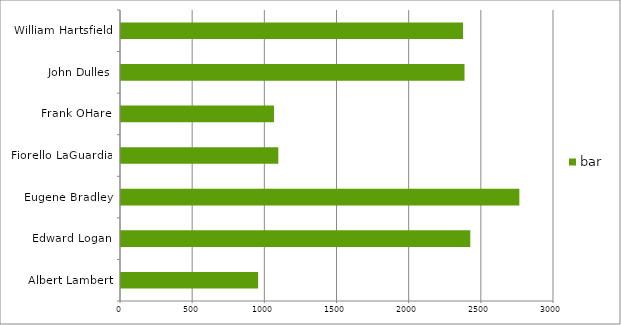
| Category | bar |
|---|---|
| Albert Lambert | 950 |
| Edward Logan | 2420 |
| Eugene Bradley | 2760 |
| Fiorello LaGuardia | 1090 |
| Frank OHare | 1060 |
| John Dulles | 2380 |
| William Hartsfield | 2370 |